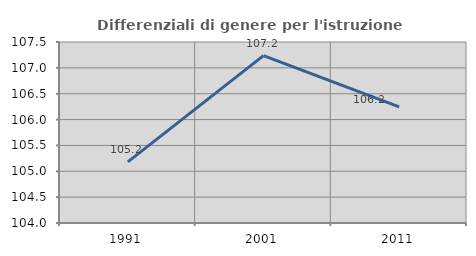
| Category | Differenziali di genere per l'istruzione superiore |
|---|---|
| 1991.0 | 105.183 |
| 2001.0 | 107.238 |
| 2011.0 | 106.246 |